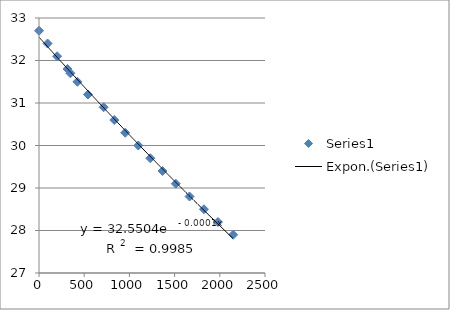
| Category | Series 0 |
|---|---|
| 0.0 | 32.7 |
| 95.0 | 32.4 |
| 200.0 | 32.1 |
| 315.0 | 31.8 |
| 347.0 | 31.7 |
| 425.0 | 31.5 |
| 542.0 | 31.2 |
| 715.0 | 30.9 |
| 833.0 | 30.6 |
| 954.0 | 30.3 |
| 1098.0 | 30 |
| 1231.0 | 29.7 |
| 1366.0 | 29.4 |
| 1513.0 | 29.1 |
| 1665.0 | 28.8 |
| 1825.0 | 28.5 |
| 1980.0 | 28.2 |
| 2148.0 | 27.9 |